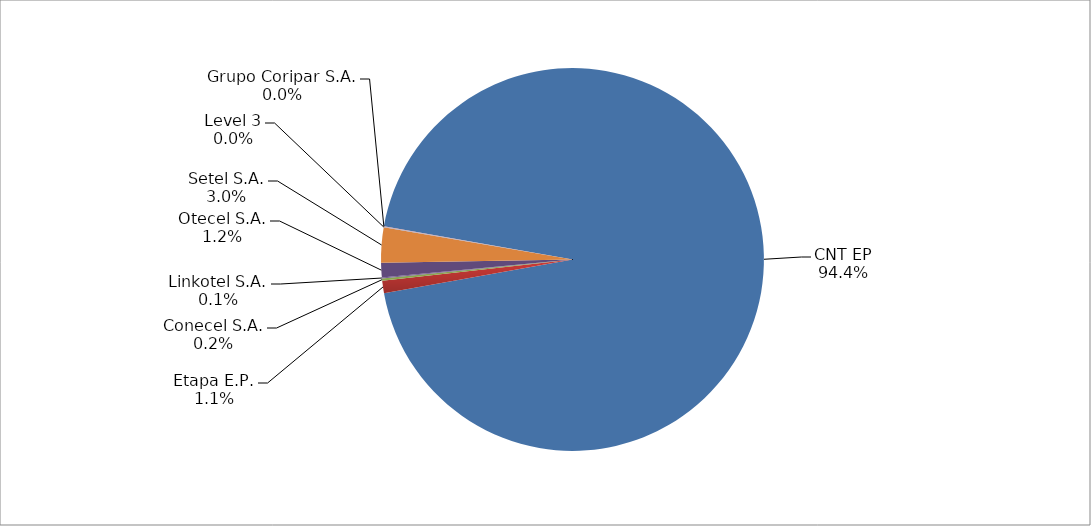
| Category | Series 0 |
|---|---|
| CNT EP | 2076 |
| Etapa E.P. | 23 |
| Conecel S.A. | 4 |
| Linkotel S.A. | 2 |
| Otecel S.A. | 27 |
| Setel S.A. | 65 |
| Level 3 | 1 |
| Grupo Coripar S.A. | 1 |